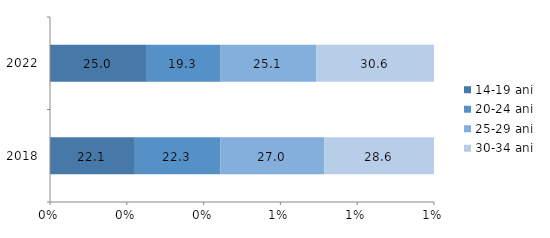
| Category | 14-19 ani | 20-24 ani | 25-29 ani | 30-34 ani |
|---|---|---|---|---|
| 2018.0 | 22.1 | 22.3 | 27 | 28.6 |
| 2022.0 | 25 | 19.3 | 25.1 | 30.6 |